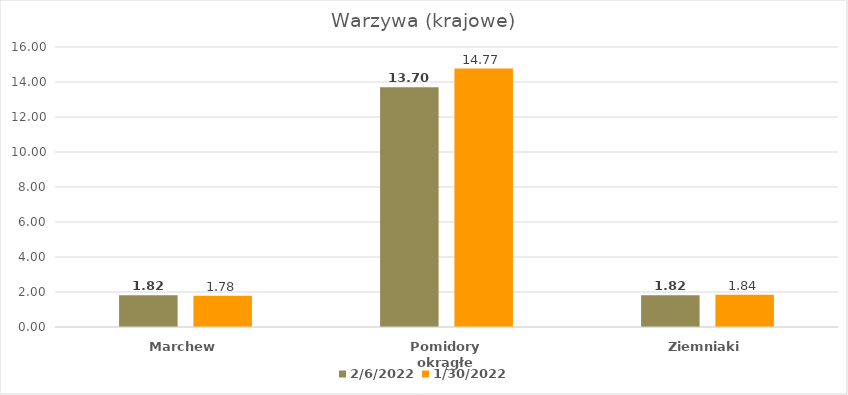
| Category | 2022-02-06 | 2022-01-30 |
|---|---|---|
| Marchew | 1.82 | 1.78 |
| Pomidory okrągłe | 13.702 | 14.77 |
| Ziemniaki | 1.816 | 1.84 |